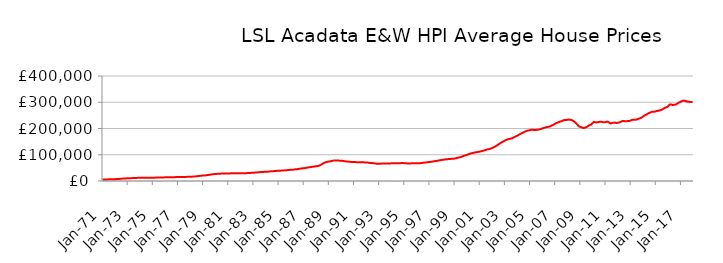
| Category | Series 0 |
|---|---|
| 1971-01-01 | 5857.099 |
| 1971-02-01 | 5898.721 |
| 1971-03-01 | 5940.69 |
| 1971-04-01 | 5995.257 |
| 1971-05-01 | 6085.811 |
| 1971-06-01 | 6180.173 |
| 1971-07-01 | 6296.211 |
| 1971-08-01 | 6422.474 |
| 1971-09-01 | 6547.728 |
| 1971-10-01 | 6677.855 |
| 1971-11-01 | 6818.329 |
| 1971-12-01 | 6989.38 |
| 1972-01-01 | 7108.105 |
| 1972-02-01 | 7185.835 |
| 1972-03-01 | 7362.77 |
| 1972-04-01 | 7610.19 |
| 1972-05-01 | 7967.676 |
| 1972-06-01 | 8281.372 |
| 1972-07-01 | 8642.042 |
| 1972-08-01 | 8989.966 |
| 1972-09-01 | 9297.181 |
| 1972-10-01 | 9584.293 |
| 1972-11-01 | 9850.157 |
| 1972-12-01 | 10124.427 |
| 1973-01-01 | 10320.635 |
| 1973-02-01 | 10459.272 |
| 1973-03-01 | 10618.649 |
| 1973-04-01 | 10800.445 |
| 1973-05-01 | 11033.528 |
| 1973-06-01 | 11184.964 |
| 1973-07-01 | 11343.564 |
| 1973-08-01 | 11519.502 |
| 1973-09-01 | 11724.824 |
| 1973-10-01 | 11937.703 |
| 1973-11-01 | 12099.932 |
| 1973-12-01 | 12216.265 |
| 1974-01-01 | 12278.659 |
| 1974-02-01 | 12345.906 |
| 1974-03-01 | 12343.151 |
| 1974-04-01 | 12316.507 |
| 1974-05-01 | 12292.995 |
| 1974-06-01 | 12293.851 |
| 1974-07-01 | 12305.806 |
| 1974-08-01 | 12345.937 |
| 1974-09-01 | 12418.941 |
| 1974-10-01 | 12508.614 |
| 1974-11-01 | 12582.928 |
| 1974-12-01 | 12656.295 |
| 1975-01-01 | 12690.239 |
| 1975-02-01 | 12733.057 |
| 1975-03-01 | 12809.047 |
| 1975-04-01 | 12917.251 |
| 1975-05-01 | 13048.614 |
| 1975-06-01 | 13118.943 |
| 1975-07-01 | 13187.906 |
| 1975-08-01 | 13283.123 |
| 1975-09-01 | 13411.985 |
| 1975-10-01 | 13555.153 |
| 1975-11-01 | 13681.21 |
| 1975-12-01 | 13816.023 |
| 1976-01-01 | 13910.94 |
| 1976-02-01 | 14000.327 |
| 1976-03-01 | 14061.489 |
| 1976-04-01 | 14126.545 |
| 1976-05-01 | 14211.659 |
| 1976-06-01 | 14267.347 |
| 1976-07-01 | 14328.946 |
| 1976-08-01 | 14420.111 |
| 1976-09-01 | 14550.577 |
| 1976-10-01 | 14697.614 |
| 1976-11-01 | 14815.266 |
| 1976-12-01 | 14920.332 |
| 1977-01-01 | 14978.752 |
| 1977-02-01 | 15045.843 |
| 1977-03-01 | 15089.348 |
| 1977-04-01 | 15140.375 |
| 1977-05-01 | 15219.189 |
| 1977-06-01 | 15290.657 |
| 1977-07-01 | 15378.53 |
| 1977-08-01 | 15499.048 |
| 1977-09-01 | 15646.436 |
| 1977-10-01 | 15812.469 |
| 1977-11-01 | 15988.119 |
| 1977-12-01 | 16217.388 |
| 1978-01-01 | 16387.646 |
| 1978-02-01 | 16520.529 |
| 1978-03-01 | 16699.603 |
| 1978-04-01 | 16940.5 |
| 1978-05-01 | 17326.688 |
| 1978-06-01 | 17717.489 |
| 1978-07-01 | 18190.142 |
| 1978-08-01 | 18674.957 |
| 1978-09-01 | 19141.546 |
| 1978-10-01 | 19605.504 |
| 1978-11-01 | 20038.14 |
| 1978-12-01 | 20465.61 |
| 1979-01-01 | 20719.894 |
| 1979-02-01 | 20890.446 |
| 1979-03-01 | 21315.285 |
| 1979-04-01 | 21897.633 |
| 1979-05-01 | 22640.795 |
| 1979-06-01 | 23112.399 |
| 1979-07-01 | 23601.894 |
| 1979-08-01 | 24153.108 |
| 1979-09-01 | 24813.49 |
| 1979-10-01 | 25518.414 |
| 1979-11-01 | 26105.339 |
| 1979-12-01 | 26561.387 |
| 1980-01-01 | 26811.766 |
| 1980-02-01 | 27006.377 |
| 1980-03-01 | 27256.081 |
| 1980-04-01 | 27548.466 |
| 1980-05-01 | 27890.49 |
| 1980-06-01 | 28073.448 |
| 1980-07-01 | 28239.352 |
| 1980-08-01 | 28392.672 |
| 1980-09-01 | 28500.777 |
| 1980-10-01 | 28570.004 |
| 1980-11-01 | 28623.211 |
| 1980-12-01 | 28736.407 |
| 1981-01-01 | 28803.696 |
| 1981-02-01 | 28905.772 |
| 1981-03-01 | 29008.123 |
| 1981-04-01 | 29145.496 |
| 1981-05-01 | 29284.776 |
| 1981-06-01 | 29332.03 |
| 1981-07-01 | 29354.565 |
| 1981-08-01 | 29360.133 |
| 1981-09-01 | 29304.834 |
| 1981-10-01 | 29203.917 |
| 1981-11-01 | 29111.269 |
| 1981-12-01 | 29101.183 |
| 1982-01-01 | 29056.216 |
| 1982-02-01 | 29075.91 |
| 1982-03-01 | 29237.156 |
| 1982-04-01 | 29508.825 |
| 1982-05-01 | 29813.139 |
| 1982-06-01 | 29924.192 |
| 1982-07-01 | 30007.98 |
| 1982-08-01 | 30167.756 |
| 1982-09-01 | 30426.834 |
| 1982-10-01 | 30734.64 |
| 1982-11-01 | 31041.297 |
| 1982-12-01 | 31421.596 |
| 1983-01-01 | 31710.573 |
| 1983-02-01 | 31958.926 |
| 1983-03-01 | 32217.705 |
| 1983-04-01 | 32538.404 |
| 1983-05-01 | 32959.019 |
| 1983-06-01 | 33289.094 |
| 1983-07-01 | 33648.489 |
| 1983-08-01 | 33989.931 |
| 1983-09-01 | 34262.869 |
| 1983-10-01 | 34486.166 |
| 1983-11-01 | 34696.88 |
| 1983-12-01 | 34973.628 |
| 1984-01-01 | 35139.033 |
| 1984-02-01 | 35306.966 |
| 1984-03-01 | 35625.808 |
| 1984-04-01 | 36068.102 |
| 1984-05-01 | 36574.401 |
| 1984-06-01 | 36798.872 |
| 1984-07-01 | 36986.734 |
| 1984-08-01 | 37272.961 |
| 1984-09-01 | 37729.704 |
| 1984-10-01 | 38258.139 |
| 1984-11-01 | 38666.556 |
| 1984-12-01 | 38950.409 |
| 1985-01-01 | 39029.205 |
| 1985-02-01 | 39138.102 |
| 1985-03-01 | 39405.822 |
| 1985-04-01 | 39781.866 |
| 1985-05-01 | 40211.244 |
| 1985-06-01 | 40377.175 |
| 1985-07-01 | 40530.576 |
| 1985-08-01 | 40796.499 |
| 1985-09-01 | 41239.987 |
| 1985-10-01 | 41746.482 |
| 1985-11-01 | 42172.184 |
| 1985-12-01 | 42512.658 |
| 1986-01-01 | 42644.997 |
| 1986-02-01 | 42780.121 |
| 1986-03-01 | 43174.822 |
| 1986-04-01 | 43745.772 |
| 1986-05-01 | 44458.382 |
| 1986-06-01 | 44889.811 |
| 1986-07-01 | 45330.85 |
| 1986-08-01 | 45857.348 |
| 1986-09-01 | 46519.092 |
| 1986-10-01 | 47233.734 |
| 1986-11-01 | 47882.417 |
| 1986-12-01 | 48487.227 |
| 1987-01-01 | 48838.123 |
| 1987-02-01 | 49128.667 |
| 1987-03-01 | 49758.892 |
| 1987-04-01 | 50607.426 |
| 1987-05-01 | 51621.288 |
| 1987-06-01 | 52193.37 |
| 1987-07-01 | 52740.656 |
| 1987-08-01 | 53342.954 |
| 1987-09-01 | 53996.738 |
| 1987-10-01 | 54673.524 |
| 1987-11-01 | 55307.611 |
| 1987-12-01 | 55964.403 |
| 1988-01-01 | 56276.628 |
| 1988-02-01 | 56545.909 |
| 1988-03-01 | 57487.723 |
| 1988-04-01 | 58905.084 |
| 1988-05-01 | 61037.696 |
| 1988-06-01 | 63189.676 |
| 1988-07-01 | 65723.584 |
| 1988-08-01 | 68054.471 |
| 1988-09-01 | 69849.248 |
| 1988-10-01 | 71339.432 |
| 1988-11-01 | 72537.93 |
| 1988-12-01 | 73602.015 |
| 1989-01-01 | 74158.246 |
| 1989-02-01 | 74628.486 |
| 1989-03-01 | 75426.633 |
| 1989-04-01 | 76442.821 |
| 1989-05-01 | 77519.393 |
| 1989-06-01 | 77989.768 |
| 1989-07-01 | 78310.021 |
| 1989-08-01 | 78460.166 |
| 1989-09-01 | 78330.725 |
| 1989-10-01 | 77968.513 |
| 1989-11-01 | 77486.646 |
| 1989-12-01 | 77093.898 |
| 1990-01-01 | 76740.415 |
| 1990-02-01 | 76725.91 |
| 1990-03-01 | 76199.214 |
| 1990-04-01 | 75515.616 |
| 1990-05-01 | 74716.307 |
| 1990-06-01 | 74334.889 |
| 1990-07-01 | 74009.871 |
| 1990-08-01 | 73693.071 |
| 1990-09-01 | 73247.891 |
| 1990-10-01 | 72739.049 |
| 1990-11-01 | 72266.798 |
| 1990-12-01 | 72066.19 |
| 1991-01-01 | 71925.169 |
| 1991-02-01 | 72000.737 |
| 1991-03-01 | 71886.267 |
| 1991-04-01 | 71810.65 |
| 1991-05-01 | 71711.122 |
| 1991-06-01 | 71666.581 |
| 1991-07-01 | 71619.253 |
| 1991-08-01 | 71552.86 |
| 1991-09-01 | 71439.218 |
| 1991-10-01 | 71235.933 |
| 1991-11-01 | 70902.967 |
| 1991-12-01 | 70550.811 |
| 1992-01-01 | 70202.03 |
| 1992-02-01 | 70148.545 |
| 1992-03-01 | 69659.307 |
| 1992-04-01 | 69068.783 |
| 1992-05-01 | 68416.922 |
| 1992-06-01 | 68203.541 |
| 1992-07-01 | 68050.122 |
| 1992-08-01 | 67728.144 |
| 1992-09-01 | 67040.926 |
| 1992-10-01 | 66188.231 |
| 1992-11-01 | 65610.202 |
| 1992-12-01 | 65627.028 |
| 1993-01-01 | 65789.392 |
| 1993-02-01 | 66076.715 |
| 1993-03-01 | 66334.89 |
| 1993-04-01 | 66657.869 |
| 1993-05-01 | 66933.229 |
| 1993-06-01 | 66964.728 |
| 1993-07-01 | 66984.652 |
| 1993-08-01 | 67039.805 |
| 1993-09-01 | 66997.849 |
| 1993-10-01 | 66877.129 |
| 1993-11-01 | 66798.132 |
| 1993-12-01 | 67031.975 |
| 1994-01-01 | 67353.66 |
| 1994-02-01 | 67754.681 |
| 1994-03-01 | 67739.395 |
| 1994-04-01 | 67575.887 |
| 1994-05-01 | 67432.293 |
| 1994-06-01 | 67445.163 |
| 1994-07-01 | 67526.204 |
| 1994-08-01 | 67692.886 |
| 1994-09-01 | 67957.824 |
| 1994-10-01 | 68278.797 |
| 1994-11-01 | 68430.703 |
| 1994-12-01 | 68341.086 |
| 1995-01-01 | 67840.321 |
| 1995-02-01 | 67409.252 |
| 1995-03-01 | 67247.167 |
| 1995-04-01 | 67078.277 |
| 1995-05-01 | 67106.887 |
| 1995-06-01 | 66964.521 |
| 1995-07-01 | 67110.493 |
| 1995-08-01 | 67175.327 |
| 1995-09-01 | 67213.665 |
| 1995-10-01 | 67189.572 |
| 1995-11-01 | 67274.294 |
| 1995-12-01 | 67356.827 |
| 1996-01-01 | 67381.261 |
| 1996-02-01 | 67340.263 |
| 1996-03-01 | 67562.769 |
| 1996-04-01 | 67825.352 |
| 1996-05-01 | 68324.235 |
| 1996-06-01 | 68689.436 |
| 1996-07-01 | 69285.813 |
| 1996-08-01 | 69862.843 |
| 1996-09-01 | 70445.834 |
| 1996-10-01 | 70870.328 |
| 1996-11-01 | 71320.394 |
| 1996-12-01 | 71956.807 |
| 1997-01-01 | 72413.294 |
| 1997-02-01 | 72899.602 |
| 1997-03-01 | 73314.95 |
| 1997-04-01 | 73989.038 |
| 1997-05-01 | 74869.528 |
| 1997-06-01 | 75538.121 |
| 1997-07-01 | 76010.138 |
| 1997-08-01 | 76762.533 |
| 1997-09-01 | 77435.697 |
| 1997-10-01 | 78307.587 |
| 1997-11-01 | 78917.258 |
| 1997-12-01 | 79691.543 |
| 1998-01-01 | 80150.909 |
| 1998-02-01 | 80840.742 |
| 1998-03-01 | 81442.487 |
| 1998-04-01 | 82189.548 |
| 1998-05-01 | 82720.234 |
| 1998-06-01 | 83046.257 |
| 1998-07-01 | 83436.657 |
| 1998-08-01 | 83801.954 |
| 1998-09-01 | 84171.706 |
| 1998-10-01 | 84417.046 |
| 1998-11-01 | 84703.285 |
| 1998-12-01 | 85047.403 |
| 1999-01-01 | 85556.74 |
| 1999-02-01 | 86573.979 |
| 1999-03-01 | 87470.695 |
| 1999-04-01 | 88360.267 |
| 1999-05-01 | 89334.426 |
| 1999-06-01 | 90364.978 |
| 1999-07-01 | 91578.238 |
| 1999-08-01 | 93148.563 |
| 1999-09-01 | 94749.323 |
| 1999-10-01 | 96220.078 |
| 1999-11-01 | 97218.749 |
| 1999-12-01 | 98560.143 |
| 2000-01-01 | 99629.931 |
| 2000-02-01 | 101558.497 |
| 2000-03-01 | 103072.341 |
| 2000-04-01 | 104686.25 |
| 2000-05-01 | 105503.332 |
| 2000-06-01 | 106505.003 |
| 2000-07-01 | 107398.644 |
| 2000-08-01 | 108231.34 |
| 2000-09-01 | 109004.527 |
| 2000-10-01 | 109798.76 |
| 2000-11-01 | 110452.916 |
| 2000-12-01 | 111285.801 |
| 2001-01-01 | 111960.525 |
| 2001-02-01 | 113007.35 |
| 2001-03-01 | 113986.625 |
| 2001-04-01 | 115189.625 |
| 2001-05-01 | 116487.424 |
| 2001-06-01 | 117563.257 |
| 2001-07-01 | 118736.735 |
| 2001-08-01 | 119906.389 |
| 2001-09-01 | 120965.66 |
| 2001-10-01 | 121676.727 |
| 2001-11-01 | 122889.975 |
| 2001-12-01 | 124233.993 |
| 2002-01-01 | 126029.609 |
| 2002-02-01 | 127774.152 |
| 2002-03-01 | 129858.691 |
| 2002-04-01 | 132103.177 |
| 2002-05-01 | 134637.358 |
| 2002-06-01 | 137203.96 |
| 2002-07-01 | 140014.339 |
| 2002-08-01 | 142511.015 |
| 2002-09-01 | 145160.827 |
| 2002-10-01 | 147642.484 |
| 2002-11-01 | 149822.53 |
| 2002-12-01 | 152222.962 |
| 2003-01-01 | 154364.126 |
| 2003-02-01 | 156121.629 |
| 2003-03-01 | 157542.226 |
| 2003-04-01 | 158901.322 |
| 2003-05-01 | 160054.939 |
| 2003-06-01 | 160982.421 |
| 2003-07-01 | 161799.907 |
| 2003-08-01 | 163407.163 |
| 2003-09-01 | 165085.617 |
| 2003-10-01 | 167279.445 |
| 2003-11-01 | 169409.242 |
| 2003-12-01 | 171192.929 |
| 2004-01-01 | 172966.816 |
| 2004-02-01 | 175317.387 |
| 2004-03-01 | 177629.827 |
| 2004-04-01 | 179672.322 |
| 2004-05-01 | 181830.595 |
| 2004-06-01 | 183844.847 |
| 2004-07-01 | 185776.963 |
| 2004-08-01 | 187799.438 |
| 2004-09-01 | 189380.654 |
| 2004-10-01 | 191097.484 |
| 2004-11-01 | 192063.133 |
| 2004-12-01 | 193045.161 |
| 2005-01-01 | 193812.671 |
| 2005-02-01 | 194920.268 |
| 2005-03-01 | 194824.213 |
| 2005-04-01 | 194886.53 |
| 2005-05-01 | 194252.283 |
| 2005-06-01 | 194754.733 |
| 2005-07-01 | 194758.996 |
| 2005-08-01 | 195023.586 |
| 2005-09-01 | 195595.548 |
| 2005-10-01 | 196735.315 |
| 2005-11-01 | 197690.624 |
| 2005-12-01 | 199374.641 |
| 2006-01-01 | 200380.275 |
| 2006-02-01 | 202077.129 |
| 2006-03-01 | 203236.201 |
| 2006-04-01 | 204573.078 |
| 2006-05-01 | 205426.874 |
| 2006-06-01 | 206081.003 |
| 2006-07-01 | 206962.371 |
| 2006-08-01 | 208136.868 |
| 2006-09-01 | 209880.732 |
| 2006-10-01 | 211961.363 |
| 2006-11-01 | 213687.029 |
| 2006-12-01 | 215979.455 |
| 2007-01-01 | 217902.407 |
| 2007-02-01 | 220599.487 |
| 2007-03-01 | 222081.478 |
| 2007-04-01 | 223953.099 |
| 2007-05-01 | 225087.853 |
| 2007-06-01 | 226902.611 |
| 2007-07-01 | 227677.181 |
| 2007-08-01 | 229556.53 |
| 2007-09-01 | 231336.889 |
| 2007-10-01 | 232654.592 |
| 2007-11-01 | 232386.457 |
| 2007-12-01 | 232602.685 |
| 2008-01-01 | 233124.632 |
| 2008-02-01 | 234080.451 |
| 2008-03-01 | 233443.019 |
| 2008-04-01 | 232956.201 |
| 2008-05-01 | 231559.518 |
| 2008-06-01 | 229767.105 |
| 2008-07-01 | 226463.267 |
| 2008-08-01 | 223301.151 |
| 2008-09-01 | 219530.165 |
| 2008-10-01 | 215494.564 |
| 2008-11-01 | 210782.123 |
| 2008-12-01 | 207481.717 |
| 2009-01-01 | 205923.033 |
| 2009-02-01 | 204646.308 |
| 2009-03-01 | 202898.37 |
| 2009-04-01 | 202052.391 |
| 2009-05-01 | 202610.113 |
| 2009-06-01 | 204238.472 |
| 2009-07-01 | 205926.281 |
| 2009-08-01 | 208273.332 |
| 2009-09-01 | 211097.843 |
| 2009-10-01 | 213573.798 |
| 2009-11-01 | 214000.528 |
| 2009-12-01 | 218298.332 |
| 2010-01-01 | 221651.889 |
| 2010-02-01 | 225410.467 |
| 2010-03-01 | 223982.059 |
| 2010-04-01 | 223233.749 |
| 2010-05-01 | 223475.854 |
| 2010-06-01 | 224374.344 |
| 2010-07-01 | 225087.982 |
| 2010-08-01 | 225826.374 |
| 2010-09-01 | 225726.935 |
| 2010-10-01 | 224880.54 |
| 2010-11-01 | 223344.521 |
| 2010-12-01 | 223431.512 |
| 2011-01-01 | 224027.46 |
| 2011-02-01 | 225878.854 |
| 2011-03-01 | 226236.193 |
| 2011-04-01 | 223971.604 |
| 2011-05-01 | 220916.115 |
| 2011-06-01 | 219251.371 |
| 2011-07-01 | 220479.179 |
| 2011-08-01 | 222149.581 |
| 2011-09-01 | 222157.49 |
| 2011-10-01 | 222484.1 |
| 2011-11-01 | 221201.223 |
| 2011-12-01 | 221301.365 |
| 2012-01-01 | 222024.785 |
| 2012-02-01 | 222809.417 |
| 2012-03-01 | 224847.539 |
| 2012-04-01 | 225896.647 |
| 2012-05-01 | 228282.33 |
| 2012-06-01 | 228302.051 |
| 2012-07-01 | 228130.641 |
| 2012-08-01 | 227557.769 |
| 2012-09-01 | 227901.47 |
| 2012-10-01 | 228272.103 |
| 2012-11-01 | 228471.705 |
| 2012-12-01 | 229216.791 |
| 2013-01-01 | 230124.603 |
| 2013-02-01 | 232110.517 |
| 2013-03-01 | 233084.804 |
| 2013-04-01 | 233726.105 |
| 2013-05-01 | 233512.274 |
| 2013-06-01 | 233765.348 |
| 2013-07-01 | 234649.684 |
| 2013-08-01 | 236237.055 |
| 2013-09-01 | 237775.881 |
| 2013-10-01 | 239310.371 |
| 2013-11-01 | 240515.318 |
| 2013-12-01 | 242810.653 |
| 2014-01-01 | 246332.936 |
| 2014-02-01 | 248753.046 |
| 2014-03-01 | 251406.951 |
| 2014-04-01 | 252880.016 |
| 2014-05-01 | 255587.82 |
| 2014-06-01 | 257885.454 |
| 2014-07-01 | 259516.338 |
| 2014-08-01 | 261463.509 |
| 2014-09-01 | 263004.333 |
| 2014-10-01 | 264015.483 |
| 2014-11-01 | 263997.097 |
| 2014-12-01 | 264169.685 |
| 2015-01-01 | 265578.766 |
| 2015-02-01 | 266724.054 |
| 2015-03-01 | 267320.643 |
| 2015-04-01 | 268109.728 |
| 2015-05-01 | 269302.109 |
| 2015-06-01 | 270929.906 |
| 2015-07-01 | 272042.681 |
| 2015-08-01 | 274765.771 |
| 2015-09-01 | 276827.774 |
| 2015-10-01 | 279786.032 |
| 2015-11-01 | 280434.612 |
| 2015-12-01 | 282607.596 |
| 2016-01-01 | 284970.142 |
| 2016-02-01 | 290947.114 |
| 2016-03-01 | 291511.611 |
| 2016-04-01 | 291407.161 |
| 2016-05-01 | 289282.406 |
| 2016-06-01 | 290107.928 |
| 2016-07-01 | 290534.452 |
| 2016-08-01 | 291483.047 |
| 2016-09-01 | 293423.173 |
| 2016-10-01 | 296201.238 |
| 2016-11-01 | 298094.467 |
| 2016-12-01 | 300292.75 |
| 2017-01-01 | 302697.303 |
| 2017-02-01 | 304441.028 |
| 2017-03-01 | 306067.587 |
| 2017-04-01 | 305890.654 |
| 2017-05-01 | 305493.942 |
| 2017-06-01 | 303597.619 |
| 2017-07-01 | 302977.922 |
| 2017-08-01 | 301770.774 |
| 2017-09-01 | 301610.733 |
| 2017-10-01 | 300613.163 |
| 2017-11-01 | 300756.139 |
| 2017-12-01 | 300846.414 |